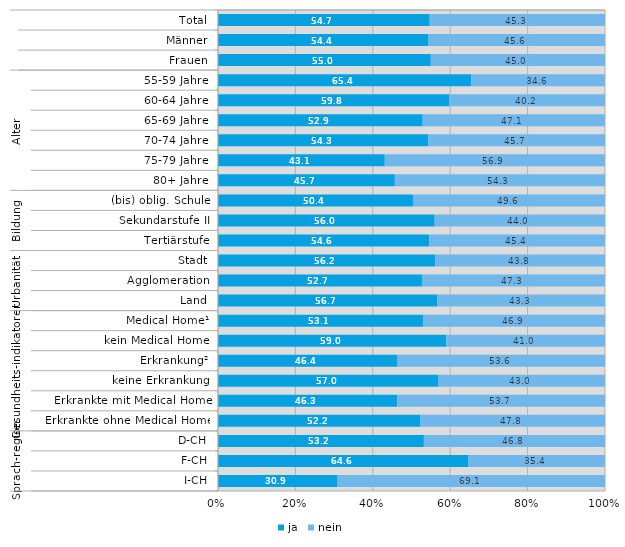
| Category | ja | nein |
|---|---|---|
| 0 | 54.7 | 45.3 |
| 1 | 54.4 | 45.6 |
| 2 | 55 | 45 |
| 3 | 65.4 | 34.6 |
| 4 | 59.8 | 40.2 |
| 5 | 52.9 | 47.1 |
| 6 | 54.3 | 45.7 |
| 7 | 43.1 | 56.9 |
| 8 | 45.7 | 54.3 |
| 9 | 50.4 | 49.6 |
| 10 | 56 | 44 |
| 11 | 54.6 | 45.4 |
| 12 | 56.2 | 43.8 |
| 13 | 52.7 | 47.3 |
| 14 | 56.7 | 43.3 |
| 15 | 53.1 | 46.9 |
| 16 | 59 | 41 |
| 17 | 46.4 | 53.6 |
| 18 | 57 | 43 |
| 19 | 46.3 | 53.7 |
| 20 | 52.2 | 47.8 |
| 21 | 53.2 | 46.8 |
| 22 | 64.6 | 35.4 |
| 23 | 30.9 | 69.1 |